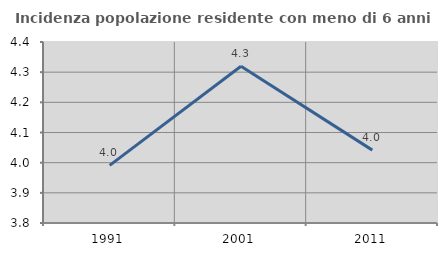
| Category | Incidenza popolazione residente con meno di 6 anni |
|---|---|
| 1991.0 | 3.991 |
| 2001.0 | 4.319 |
| 2011.0 | 4.042 |